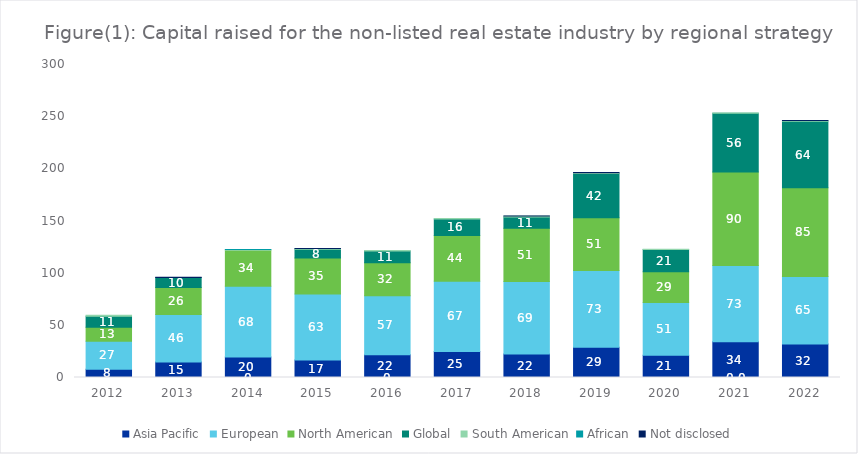
| Category | Asia Pacific | European | North American | Global | South American | African | Not disclosed |
|---|---|---|---|---|---|---|---|
| 2012.0 | 7.864 | 26.903 | 13.313 | 10.623 | 0.897 | 0 | 0 |
| 2013.0 | 14.741 | 45.747 | 25.706 | 9.585 | 0 | 0 | 0.421 |
| 2014.0 | 19.568 | 67.806 | 34.495 | 0 | 0.744 | 0.1 | -0.014 |
| 2015.0 | 16.865 | 63.122 | 34.536 | 8.471 | 0.588 | 0 | 0.019 |
| 2016.0 | 21.726 | 56.6 | 31.628 | 11.322 | 0.56 | 0 | -0.037 |
| 2017.0 | 24.924 | 67.221 | 43.905 | 15.77 | 0.479 | 0 | 0 |
| 2018.0 | 22.484 | 69.419 | 51.255 | 10.577 | 1.06 | 0 | 0.005 |
| 2019.0 | 29.104 | 73.339 | 50.668 | 42.375 | 0.787 | 0 | 0.127 |
| 2020.0 | 21.338 | 50.646 | 29.467 | 21.313 | 0.139 | 0 | 0 |
| 2021.0 | 34.314 | 72.976 | 89.584 | 56.327 | 0.417 | 0 | 0 |
| 2022.0 | 32.042 | 64.718 | 84.996 | 63.871 | 0.64 | 0 | 0.036 |